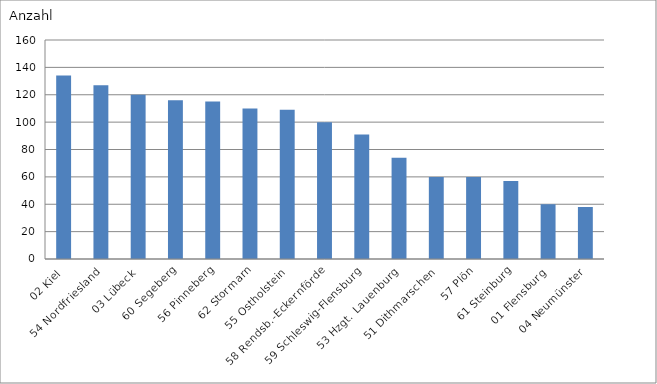
| Category | 02 Kiel |
|---|---|
| 02 Kiel | 134 |
| 54 Nordfriesland | 127 |
| 03 Lübeck | 120 |
| 60 Segeberg | 116 |
| 56 Pinneberg | 115 |
| 62 Stormarn | 110 |
| 55 Ostholstein | 109 |
| 58 Rendsb.-Eckernförde | 100 |
| 59 Schleswig-Flensburg | 91 |
| 53 Hzgt. Lauenburg | 74 |
| 51 Dithmarschen | 60 |
| 57 Plön | 60 |
| 61 Steinburg | 57 |
| 01 Flensburg | 40 |
| 04 Neumünster | 38 |